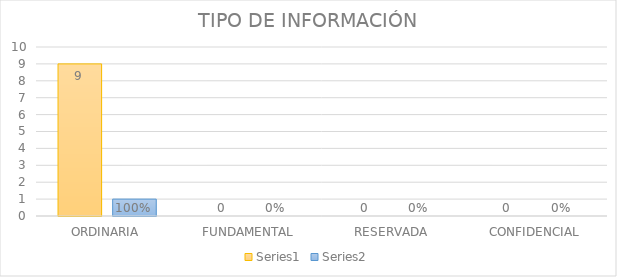
| Category | Series 3 | Series 4 |
|---|---|---|
| ORDINARIA | 9 | 1 |
| FUNDAMENTAL | 0 | 0 |
| RESERVADA | 0 | 0 |
| CONFIDENCIAL | 0 | 0 |